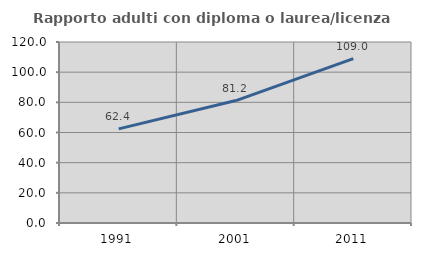
| Category | Rapporto adulti con diploma o laurea/licenza media  |
|---|---|
| 1991.0 | 62.428 |
| 2001.0 | 81.162 |
| 2011.0 | 108.989 |